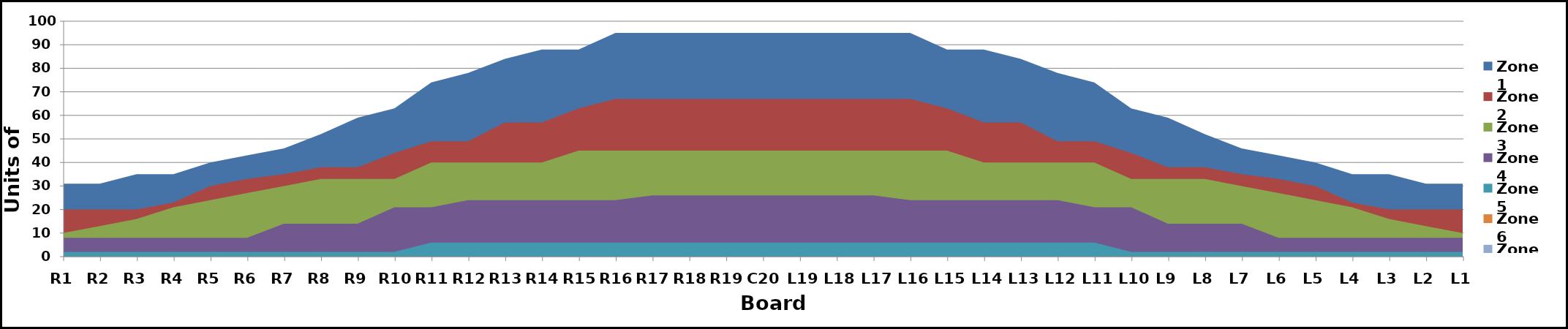
| Category | Zone 1 | Zone 2 | Zone 3 | Zone 4 | Zone 5 | Zone 6 | Zone 7 | Zone 8 |
|---|---|---|---|---|---|---|---|---|
| L1 | 31 | 20 | 10 | 8 | 2 | 0 |  |  |
| L2 | 31 | 20 | 13 | 8 | 2 | 0 |  |  |
| L3 | 35 | 20 | 16 | 8 | 2 | 0 |  |  |
| L4 | 35 | 23 | 21 | 8 | 2 | 0 |  |  |
| L5 | 40 | 30 | 24 | 8 | 2 | 0 |  |  |
| L6 | 43 | 33 | 27 | 8 | 2 | 0 |  |  |
| L7 | 46 | 35 | 30 | 14 | 2 | 0 |  |  |
| L8 | 52 | 38 | 33 | 14 | 2 | 0 |  |  |
| L9 | 59 | 38 | 33 | 14 | 2 | 0 |  |  |
| L10 | 63 | 44 | 33 | 21 | 2 | 0 |  |  |
| L11 | 74 | 49 | 40 | 21 | 6 | 0 |  |  |
| L12 | 78 | 49 | 40 | 24 | 6 | 0 |  |  |
| L13 | 84 | 57 | 40 | 24 | 6 | 0 |  |  |
| L14 | 88 | 57 | 40 | 24 | 6 | 0 |  |  |
| L15 | 88 | 63 | 45 | 24 | 6 | 0 |  |  |
| L16 | 95 | 67 | 45 | 24 | 6 | 0 |  |  |
| L17 | 95 | 67 | 45 | 26 | 6 | 0 |  |  |
| L18 | 95 | 67 | 45 | 26 | 6 | 0 |  |  |
| L19 | 95 | 67 | 45 | 26 | 6 | 0 |  |  |
| C20 | 95 | 67 | 45 | 26 | 6 | 0 |  |  |
| R19 | 95 | 67 | 45 | 26 | 6 | 0 |  |  |
| R18 | 95 | 67 | 45 | 26 | 6 | 0 |  |  |
| R17 | 95 | 67 | 45 | 26 | 6 | 0 |  |  |
| R16 | 95 | 67 | 45 | 24 | 6 | 0 |  |  |
| R15 | 88 | 63 | 45 | 24 | 6 | 0 |  |  |
| R14 | 88 | 57 | 40 | 24 | 6 | 0 |  |  |
| R13 | 84 | 57 | 40 | 24 | 6 | 0 |  |  |
| R12 | 78 | 49 | 40 | 24 | 6 | 0 |  |  |
| R11 | 74 | 49 | 40 | 21 | 6 | 0 |  |  |
| R10 | 63 | 44 | 33 | 21 | 2 | 0 |  |  |
| R9 | 59 | 38 | 33 | 14 | 2 | 0 |  |  |
| R8 | 52 | 38 | 33 | 14 | 2 | 0 |  |  |
| R7 | 46 | 35 | 30 | 14 | 2 | 0 |  |  |
| R6 | 43 | 33 | 27 | 8 | 2 | 0 |  |  |
| R5 | 40 | 30 | 24 | 8 | 2 | 0 |  |  |
| R4 | 35 | 23 | 21 | 8 | 2 | 0 |  |  |
| R3 | 35 | 20 | 16 | 8 | 2 | 0 |  |  |
| R2 | 31 | 20 | 13 | 8 | 2 | 0 |  |  |
| R1 | 31 | 20 | 10 | 8 | 2 | 0 |  |  |